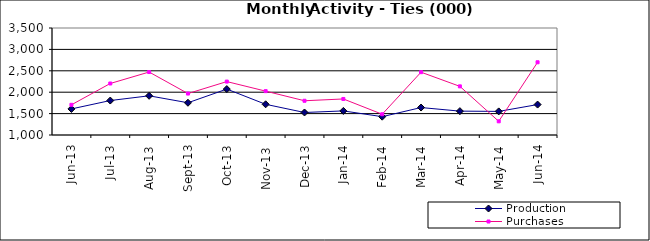
| Category | Production | Purchases |
|---|---|---|
| 2009-06-01 | 1609.116 | 1705.243 |
| 2009-07-01 | 1804.984 | 2203.49 |
| 2009-08-01 | 1915.765 | 2471.28 |
| 2009-09-01 | 1753.392 | 1968.263 |
| 2009-10-01 | 2072.87 | 2248.057 |
| 2009-11-01 | 1717.303 | 2024.778 |
| 2009-12-01 | 1525.855 | 1799.99 |
| 2010-01-01 | 1562.786 | 1842.078 |
| 2010-02-01 | 1428.045 | 1484.977 |
| 2010-03-01 | 1641.75 | 2467.773 |
| 2010-04-01 | 1557.532 | 2136.58 |
| 2010-05-01 | 1551.352 | 1319.681 |
| 2010-06-01 | 1711.075 | 2699.264 |